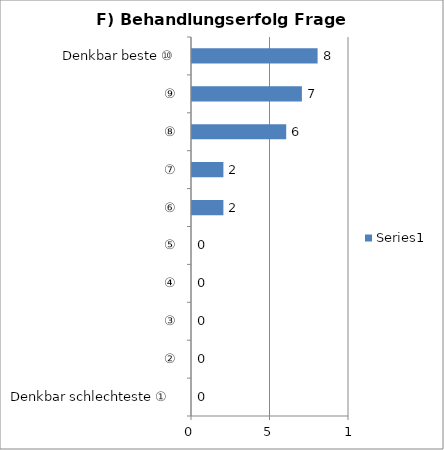
| Category | Series 0 |
|---|---|
| Denkbar schlechteste ①  | 0 |
| ② | 0 |
| ③ | 0 |
| ④ | 0 |
| ⑤ | 0 |
| ⑥ | 2 |
| ⑦ | 2 |
| ⑧ | 6 |
| ⑨ | 7 |
| Denkbar beste ⑩ | 8 |